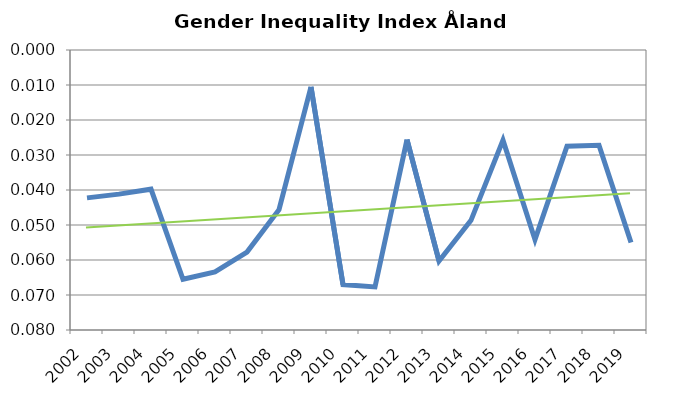
| Category | Series 0 |
|---|---|
| 2002.0 | 0.042 |
| 2003.0 | 0.041 |
| 2004.0 | 0.04 |
| 2005.0 | 0.066 |
| 2006.0 | 0.063 |
| 2007.0 | 0.058 |
| 2008.0 | 0.046 |
| 2009.0 | 0.011 |
| 2010.0 | 0.067 |
| 2011.0 | 0.068 |
| 2012.0 | 0.026 |
| 2013.0 | 0.06 |
| 2014.0 | 0.049 |
| 2015.0 | 0.026 |
| 2016.0 | 0.054 |
| 2017.0 | 0.027 |
| 2018.0 | 0.027 |
| 2019.0 | 0.055 |